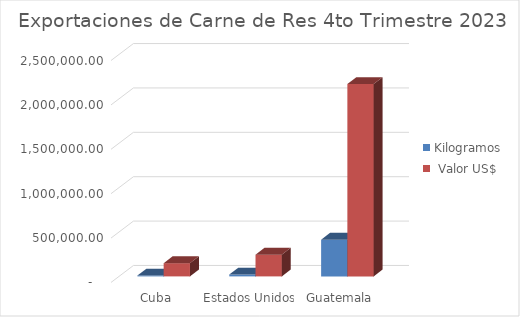
| Category | Kilogramos |  Valor US$ |
|---|---|---|
| Cuba | 10339.53 | 149193.8 |
| Estados Unidos | 21258.62 | 244975.15 |
| Guatemala | 413824.08 | 2167713.41 |